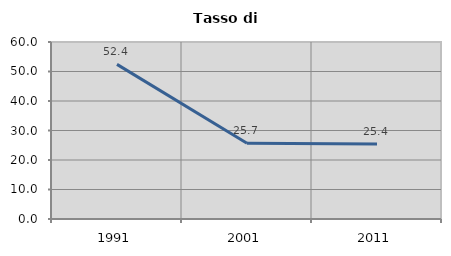
| Category | Tasso di disoccupazione   |
|---|---|
| 1991.0 | 52.414 |
| 2001.0 | 25.691 |
| 2011.0 | 25.399 |